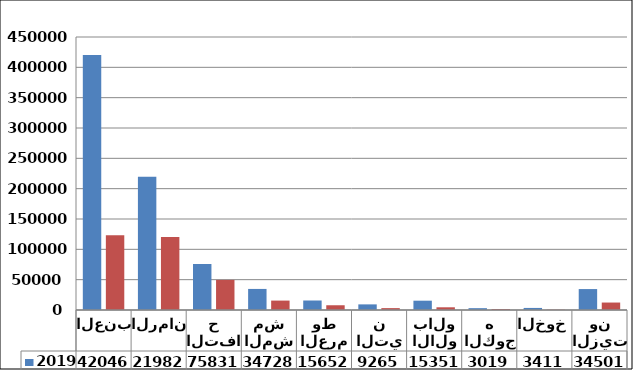
| Category | 2019 | 2018 |
|---|---|---|
| العنب | 420466 | 123083 |
| الرمان | 219822 | 120400 |
| التفاح | 75831 | 49644 |
| المشمش | 34728 | 15517 |
| العرموط | 15652 | 7822 |
| التين | 9265 | 3104 |
| الالوبالو | 15351 | 4464 |
| الكوجه | 3019 | 1670 |
| الخوخ | 3411 | 548 |
| الزيتون | 34501 | 12292 |